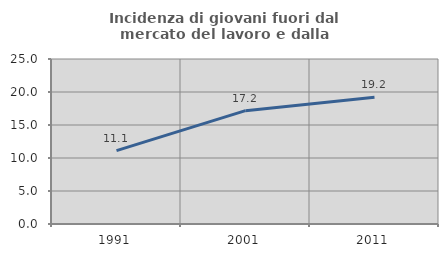
| Category | Incidenza di giovani fuori dal mercato del lavoro e dalla formazione  |
|---|---|
| 1991.0 | 11.111 |
| 2001.0 | 17.172 |
| 2011.0 | 19.205 |